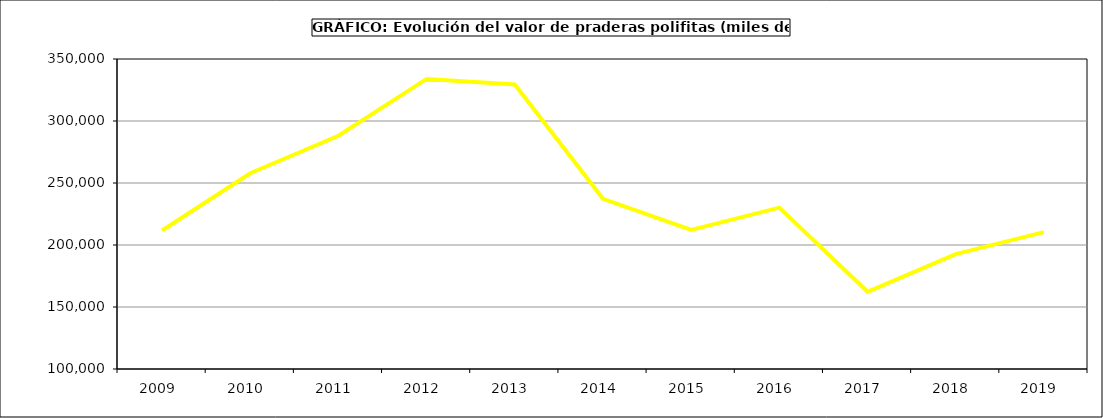
| Category | Valor |
|---|---|
| 2009.0 | 211697.199 |
| 2010.0 | 257899.036 |
| 2011.0 | 288090.963 |
| 2012.0 | 333939.944 |
| 2013.0 | 329402.741 |
| 2014.0 | 237285.995 |
| 2015.0 | 212093 |
| 2016.0 | 230171 |
| 2017.0 | 162246.482 |
| 2018.0 | 192621.026 |
| 2019.0 | 210388.231 |